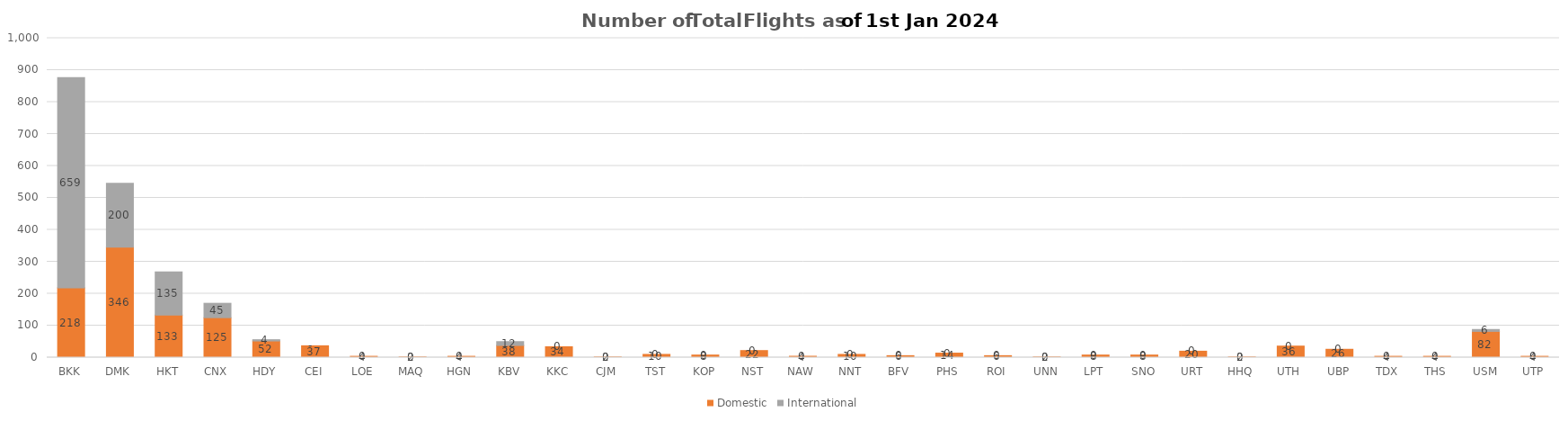
| Category | Domestic | International |
|---|---|---|
| BKK | 218 | 659 |
| DMK | 346 | 200 |
| HKT | 133 | 135 |
| CNX | 125 | 45 |
| HDY | 52 | 4 |
| CEI | 37 | 0 |
| LOE | 4 | 0 |
| MAQ | 2 | 0 |
| HGN | 4 | 0 |
| KBV | 38 | 12 |
| KKC | 34 | 0 |
| CJM | 2 | 0 |
| TST | 10 | 0 |
| KOP | 8 | 0 |
| NST | 22 | 0 |
| NAW | 4 | 0 |
| NNT | 10 | 0 |
| BFV | 6 | 0 |
| PHS | 14 | 0 |
| ROI | 6 | 0 |
| UNN | 2 | 0 |
| LPT | 8 | 0 |
| SNO | 8 | 0 |
| URT | 20 | 0 |
| HHQ | 2 | 0 |
| UTH | 36 | 0 |
| UBP | 26 | 0 |
| TDX | 4 | 0 |
| THS | 4 | 0 |
| USM | 82 | 6 |
| UTP | 4 | 0 |